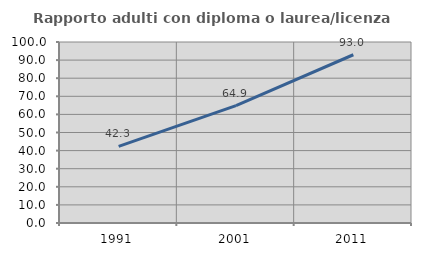
| Category | Rapporto adulti con diploma o laurea/licenza media  |
|---|---|
| 1991.0 | 42.306 |
| 2001.0 | 64.873 |
| 2011.0 | 92.956 |